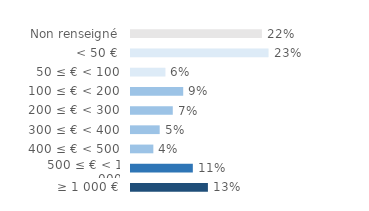
| Category | Series 0 |
|---|---|
| Non renseigné | 0.223 |
| < 50 € | 0.234 |
| 50 ≤ € < 100 | 0.059 |
| 100 ≤ € < 200 | 0.089 |
| 200 ≤ € < 300 | 0.071 |
| 300 ≤ € < 400 | 0.049 |
| 400 ≤ € < 500 | 0.038 |
| 500 ≤ € < 1 000 | 0.105 |
| ≥ 1 000 € | 0.131 |